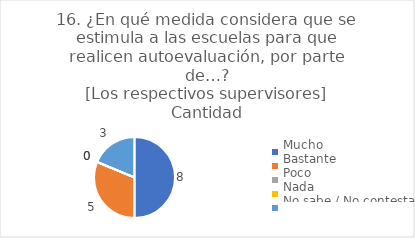
| Category | 16. ¿En qué medida considera que se estimula a las escuelas para que realicen autoevaluación, por parte de…?
[Los respectivos supervisores] |
|---|---|
| Mucho  | 0.5 |
| Bastante  | 0.312 |
| Poco  | 0 |
| Nada  | 0 |
| No sabe / No contesta | 0.188 |